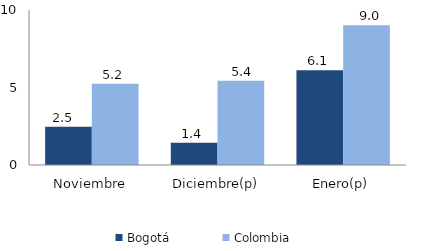
| Category | Bogotá | Colombia |
|---|---|---|
| Noviembre | 2.462 | 5.238 |
| Diciembre(p) | 1.433 | 5.431 |
| Enero(p) | 6.116 | 9.016 |